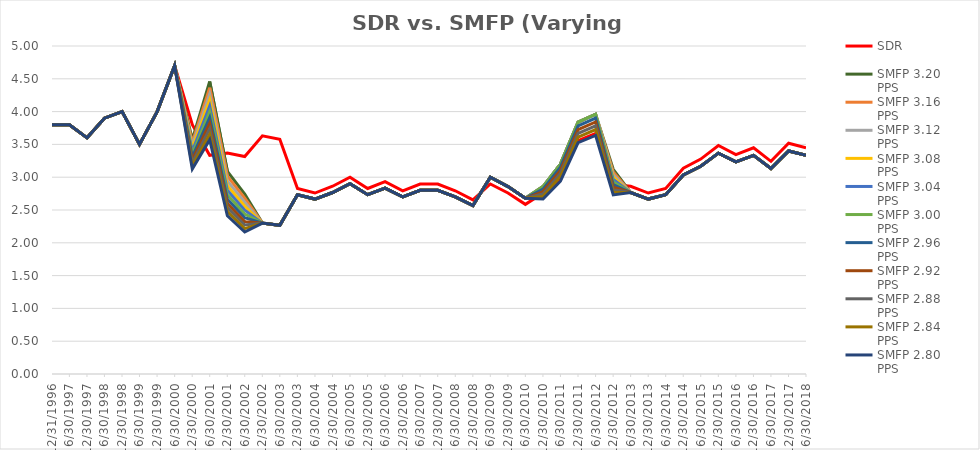
| Category | SDR | SMFP 3.20 PPS | SMFP 3.16 PPS | SMFP 3.12 PPS | SMFP 3.08 PPS | SMFP 3.04 PPS | SMFP 3.00 PPS | SMFP 2.96 PPS | SMFP 2.92 PPS | SMFP 2.88 PPS | SMFP 2.84 PPS | SMFP 2.80 PPS |
|---|---|---|---|---|---|---|---|---|---|---|---|---|
| 12/31/96 | 3.8 | 3.8 | 3.8 | 3.8 | 3.8 | 3.8 | 3.8 | 3.8 | 3.8 | 3.8 | 3.8 | 3.8 |
| 6/30/97 | 3.8 | 3.8 | 3.8 | 3.8 | 3.8 | 3.8 | 3.8 | 3.8 | 3.8 | 3.8 | 3.8 | 3.8 |
| 12/31/97 | 3.6 | 3.6 | 3.6 | 3.6 | 3.6 | 3.6 | 3.6 | 3.6 | 3.6 | 3.6 | 3.6 | 3.6 |
| 6/30/98 | 3.9 | 3.9 | 3.9 | 3.9 | 3.9 | 3.9 | 3.9 | 3.9 | 3.9 | 3.9 | 3.9 | 3.9 |
| 12/31/98 | 4 | 4 | 4 | 4 | 4 | 4 | 4 | 4 | 4 | 4 | 4 | 4 |
| 6/30/99 | 3.5 | 3.5 | 3.5 | 3.5 | 3.5 | 3.5 | 3.5 | 3.5 | 3.5 | 3.5 | 3.5 | 3.5 |
| 12/31/99 | 4 | 4 | 4 | 4 | 4 | 4 | 4 | 4 | 4 | 4 | 4 | 4 |
| 6/30/00 | 4.7 | 4.7 | 4.7 | 4.7 | 4.7 | 4.7 | 4.7 | 4.7 | 4.7 | 4.7 | 4.7 | 4.7 |
| 12/31/00 | 3.8 | 3.574 | 3.529 | 3.484 | 3.44 | 3.395 | 3.35 | 3.306 | 3.261 | 3.216 | 3.172 | 3.127 |
| 6/30/01 | 3.333 | 4.46 | 4.363 | 4.269 | 4.176 | 4.085 | 3.995 | 3.907 | 3.821 | 3.736 | 3.652 | 3.57 |
| 12/31/01 | 3.368 | 3.09 | 3.015 | 2.942 | 2.87 | 2.8 | 2.732 | 2.665 | 2.6 | 2.536 | 2.474 | 2.413 |
| 6/30/02 | 3.316 | 2.743 | 2.679 | 2.617 | 2.556 | 2.497 | 2.438 | 2.381 | 2.325 | 2.271 | 2.217 | 2.164 |
| 12/31/02 | 3.632 | 2.3 | 2.3 | 2.3 | 2.3 | 2.3 | 2.3 | 2.3 | 2.3 | 2.3 | 2.3 | 2.3 |
| 6/30/03 | 3.579 | 2.267 | 2.267 | 2.267 | 2.267 | 2.267 | 2.267 | 2.267 | 2.267 | 2.267 | 2.267 | 2.267 |
| 12/31/03 | 2.828 | 2.733 | 2.733 | 2.733 | 2.733 | 2.733 | 2.733 | 2.733 | 2.733 | 2.733 | 2.733 | 2.733 |
| 6/30/04 | 2.759 | 2.667 | 2.667 | 2.667 | 2.667 | 2.667 | 2.667 | 2.667 | 2.667 | 2.667 | 2.667 | 2.667 |
| 12/31/04 | 2.862 | 2.767 | 2.767 | 2.767 | 2.767 | 2.767 | 2.767 | 2.767 | 2.767 | 2.767 | 2.767 | 2.767 |
| 6/30/05 | 3 | 2.9 | 2.9 | 2.9 | 2.9 | 2.9 | 2.9 | 2.9 | 2.9 | 2.9 | 2.9 | 2.9 |
| 12/31/05 | 2.828 | 2.733 | 2.733 | 2.733 | 2.733 | 2.733 | 2.733 | 2.733 | 2.733 | 2.733 | 2.733 | 2.733 |
| 6/30/06 | 2.931 | 2.833 | 2.833 | 2.833 | 2.833 | 2.833 | 2.833 | 2.833 | 2.833 | 2.833 | 2.833 | 2.833 |
| 12/31/06 | 2.793 | 2.7 | 2.7 | 2.7 | 2.7 | 2.7 | 2.7 | 2.7 | 2.7 | 2.7 | 2.7 | 2.7 |
| 6/30/07 | 2.897 | 2.8 | 2.8 | 2.8 | 2.8 | 2.8 | 2.8 | 2.8 | 2.8 | 2.8 | 2.8 | 2.8 |
| 12/31/07 | 2.897 | 2.8 | 2.8 | 2.8 | 2.8 | 2.8 | 2.8 | 2.8 | 2.8 | 2.8 | 2.8 | 2.8 |
| 6/30/08 | 2.793 | 2.7 | 2.7 | 2.7 | 2.7 | 2.7 | 2.7 | 2.7 | 2.7 | 2.7 | 2.7 | 2.7 |
| 12/31/08 | 2.655 | 2.567 | 2.567 | 2.567 | 2.567 | 2.567 | 2.567 | 2.567 | 2.567 | 2.567 | 2.567 | 2.567 |
| 6/30/09 | 2.897 | 3 | 3 | 3 | 3 | 3 | 3 | 3 | 3 | 3 | 3 | 3 |
| 12/31/09 | 2.759 | 2.857 | 2.857 | 2.857 | 2.857 | 2.857 | 2.857 | 2.857 | 2.857 | 2.857 | 2.857 | 2.857 |
| 6/30/10 | 2.586 | 2.679 | 2.679 | 2.679 | 2.679 | 2.679 | 2.679 | 2.679 | 2.679 | 2.679 | 2.679 | 2.679 |
| 12/31/10 | 2.759 | 2.857 | 2.857 | 2.857 | 2.857 | 2.857 | 2.857 | 2.819 | 2.781 | 2.743 | 2.705 | 2.667 |
| 6/30/11 | 2.963 | 3.2 | 3.2 | 3.2 | 3.2 | 3.2 | 3.2 | 3.152 | 3.105 | 3.057 | 3.01 | 2.939 |
| 12/31/11 | 3.556 | 3.84 | 3.84 | 3.84 | 3.84 | 3.84 | 3.84 | 3.783 | 3.726 | 3.669 | 3.612 | 3.527 |
| 6/30/12 | 3.667 | 3.96 | 3.96 | 3.96 | 3.96 | 3.96 | 3.96 | 3.901 | 3.842 | 3.783 | 3.725 | 3.637 |
| 12/31/12 | 2.889 | 3.12 | 3.081 | 3.042 | 3.003 | 2.964 | 2.925 | 2.886 | 2.847 | 2.808 | 2.769 | 2.73 |
| 6/30/13 | 2.862 | 2.767 | 2.767 | 2.767 | 2.767 | 2.767 | 2.767 | 2.767 | 2.767 | 2.767 | 2.767 | 2.767 |
| 12/31/13 | 2.759 | 2.667 | 2.667 | 2.667 | 2.667 | 2.667 | 2.667 | 2.667 | 2.667 | 2.667 | 2.667 | 2.667 |
| 6/30/14 | 2.828 | 2.733 | 2.733 | 2.733 | 2.733 | 2.733 | 2.733 | 2.733 | 2.733 | 2.733 | 2.733 | 2.733 |
| 12/31/14 | 3.138 | 3.033 | 3.033 | 3.033 | 3.033 | 3.033 | 3.033 | 3.033 | 3.033 | 3.033 | 3.033 | 3.033 |
| 6/30/15 | 3.276 | 3.167 | 3.167 | 3.167 | 3.167 | 3.167 | 3.167 | 3.167 | 3.167 | 3.167 | 3.167 | 3.167 |
| 12/31/15 | 3.483 | 3.367 | 3.367 | 3.367 | 3.367 | 3.367 | 3.367 | 3.367 | 3.367 | 3.367 | 3.367 | 3.367 |
| 6/30/16 | 3.345 | 3.233 | 3.233 | 3.233 | 3.233 | 3.233 | 3.233 | 3.233 | 3.233 | 3.233 | 3.233 | 3.233 |
| 12/31/16 | 3.448 | 3.333 | 3.333 | 3.333 | 3.333 | 3.333 | 3.333 | 3.333 | 3.333 | 3.333 | 3.333 | 3.333 |
| 6/30/17 | 3.241 | 3.133 | 3.133 | 3.133 | 3.133 | 3.133 | 3.133 | 3.133 | 3.133 | 3.133 | 3.133 | 3.133 |
| 12/31/17 | 3.517 | 3.4 | 3.4 | 3.4 | 3.4 | 3.4 | 3.4 | 3.4 | 3.4 | 3.4 | 3.4 | 3.4 |
| 6/30/18 | 3.448 | 3.333 | 3.333 | 3.333 | 3.333 | 3.333 | 3.333 | 3.333 | 3.333 | 3.333 | 3.333 | 3.333 |